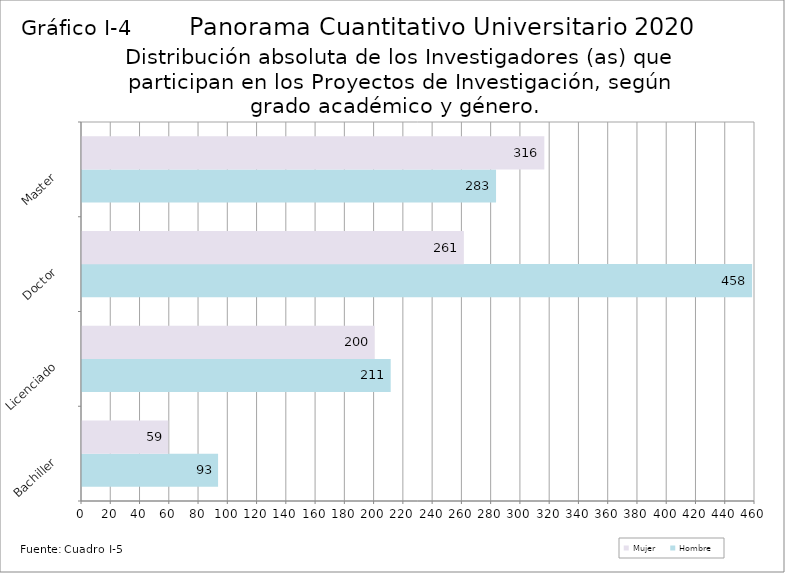
| Category | Hombre | Mujer |
|---|---|---|
| Bachiller | 93 | 59 |
| Licenciado | 211 | 200 |
| Doctor | 458 | 261 |
| Master | 283 | 316 |